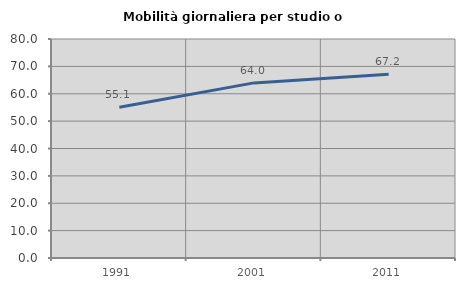
| Category | Mobilità giornaliera per studio o lavoro |
|---|---|
| 1991.0 | 55.062 |
| 2001.0 | 63.968 |
| 2011.0 | 67.157 |